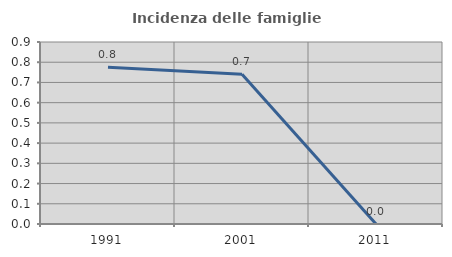
| Category | Incidenza delle famiglie numerose |
|---|---|
| 1991.0 | 0.775 |
| 2001.0 | 0.741 |
| 2011.0 | 0 |